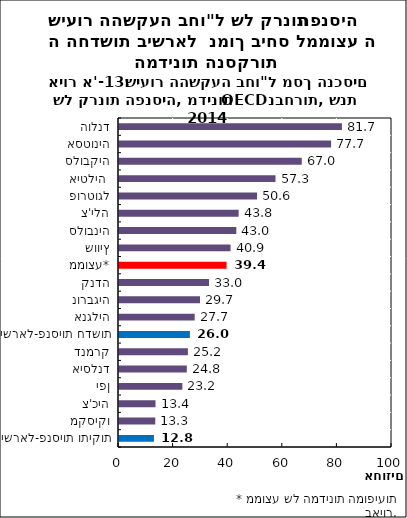
| Category | Series 0 |
|---|---|
| הולנד | 81.664 |
| אסטוניה | 77.691 |
| סלובקיה | 66.951 |
| איטליה  | 57.328 |
| פורטוגל | 50.581 |
| צ'ילה | 43.825 |
| סלובניה | 42.978 |
| שוויץ | 40.862 |
| ממוצע* | 39.406 |
| קנדה | 32.983 |
| נורבגיה | 29.679 |
| אנגליה | 27.724 |
| ישראל-פנסיות חדשות | 25.971 |
| דנמרק | 25.239 |
| איסלנד | 24.83 |
| יפן | 23.209 |
| צ'כיה | 13.377 |
| מקסיקו | 13.285 |
| ישראל-פנסיות ותיקות | 12.8 |